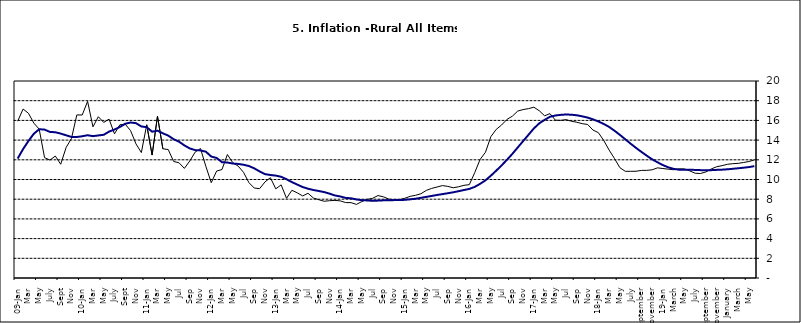
| Category | Series 0 | Series 1 |
|---|---|---|
| 09-Jan | 15.918 | 12.128 |
| Feb | 17.154 | 13.086 |
| Mar | 16.729 | 13.912 |
| Apr | 15.727 | 14.644 |
| May | 15.113 | 15.104 |
| June | 12.213 | 15.067 |
| July | 11.974 | 14.832 |
| Aug | 12.38 | 14.796 |
| Sept | 11.548 | 14.661 |
| Oct | 13.242 | 14.488 |
| Nov | 14.164 | 14.321 |
|  | 16.557 | 14.316 |
| 10-Jan | 16.548 | 14.39 |
| Feb | 17.934 | 14.494 |
| Mar | 15.346 | 14.401 |
| Apr | 16.373 | 14.473 |
| May | 15.794 | 14.54 |
| June | 16.126 | 14.862 |
| July | 14.634 | 15.072 |
| Aug | 15.556 | 15.33 |
| Sept | 15.616 | 15.658 |
| Oct | 14.955 | 15.786 |
| Nov | 13.616 | 15.719 |
| Dec | 12.735 | 15.385 |
| 11-Jan | 15.553 | 15.311 |
| Feb | 12.482 | 14.856 |
| Mar | 16.422 | 14.956 |
| Apr | 13.117 | 14.687 |
| May | 13.041 | 14.457 |
| Jun | 11.83 | 14.095 |
| Jul | 11.699 | 13.84 |
| Aug | 11.13 | 13.464 |
| Sep | 11.878 | 13.156 |
| Oct | 12.778 | 12.985 |
| Nov | 13.147 | 12.95 |
| Dec | 11.326 | 12.824 |
| 12-Jan | 9.678 | 12.33 |
| Feb | 10.856 | 12.188 |
| Mar | 11.014 | 11.76 |
| Apr | 12.536 | 11.724 |
| May | 11.712 | 11.621 |
| Jun | 11.36 | 11.582 |
| Jul | 10.733 | 11.499 |
| Aug | 9.683 | 11.368 |
| Sep | 9.132 | 11.131 |
| Oct | 9.071 | 10.82 |
| Nov | 9.758 | 10.548 |
| Dec | 10.183 | 10.455 |
| 13-Jan | 9.052 | 10.394 |
| Feb | 9.457 | 10.276 |
| Mar | 8.091 | 10.025 |
| Apr | 8.907 | 9.732 |
| May | 8.647 | 9.483 |
| Jun | 8.333 | 9.236 |
| Jul | 8.6 | 9.063 |
| Aug | 8.12 | 8.933 |
| Sep | 7.95 | 8.832 |
| Oct | 7.791 | 8.722 |
| Nov | 7.849 | 8.565 |
| Dec | 7.879 | 8.378 |
| 14-Jan | 7.832 | 8.277 |
| Feb | 7.657 | 8.13 |
| Mar | 7.65 | 8.092 |
| Apr | 7.473 | 7.973 |
| May | 7.761 | 7.901 |
| Jun | 7.98 | 7.874 |
| Jul | 8.086 | 7.834 |
| Aug | 8.368 | 7.858 |
| Sep | 8.244 | 7.883 |
| Oct | 8.019 | 7.903 |
| Nov | 7.898 | 7.906 |
| Dec | 7.955 | 7.913 |
| 15-Jan | 8.094 | 7.935 |
| Feb | 8.291 | 7.988 |
| Mar | 8.396 | 8.05 |
| Apr | 8.556 | 8.14 |
| May | 8.896 | 8.236 |
| Jun | 9.098 | 8.331 |
| Jul | 9.238 | 8.429 |
| Aug | 9.382 | 8.516 |
| Sep | 9.3 | 8.606 |
| Oct | 9.162 | 8.7 |
| Nov | 9.261 | 8.813 |
| Dec | 9.41 | 8.933 |
| 16-Jan | 9.48 | 9.047 |
| Feb | 10.692 | 9.249 |
| Mar | 12.038 | 9.559 |
| Apr | 12.767 | 9.917 |
| May | 14.349 | 10.384 |
| Jun | 15.088 | 10.897 |
| Jul | 15.533 | 11.433 |
| Aug | 16.103 | 12.002 |
| Sep | 16.428 | 12.601 |
| Oct | 16.947 | 13.25 |
| Nov | 17.099 | 13.898 |
| Dec | 17.195 | 14.54 |
| 17-Jan | 17.341 | 15.183 |
| Feb | 16.982 | 15.696 |
| Mar | 16.466 | 16.054 |
| Apr | 16.687 | 16.369 |
| May | 16.023 | 16.497 |
| Jun | 16.007 | 16.563 |
| Jul | 16.078 | 16.6 |
| Aug | 15.914 | 16.577 |
| Sep | 15.812 | 16.52 |
| Oct | 15.666 | 16.411 |
| Nov | 15.587 | 16.285 |
| Dec | 15.018 | 16.104 |
| 18-Jan | 14.756 | 15.892 |
| Feb | 13.957 | 15.638 |
| Mar | 12.987 | 15.339 |
| Apr | 12.126 | 14.95 |
| May | 11.199 | 14.53 |
| June | 10.832 | 14.083 |
| July | 10.831 | 13.636 |
| August | 10.838 | 13.209 |
| September | 10.924 | 12.804 |
| October | 10.927 | 12.418 |
| November | 10.986 | 12.049 |
| December | 11.183 | 11.746 |
| 19-Jan | 11.115 | 11.462 |
| February | 11.048 | 11.234 |
| March | 10.99 | 11.078 |
| April | 11.08 | 10.997 |
| May | 11.075 | 10.988 |
| June | 10.874 | 10.99 |
| July | 10.636 | 10.972 |
| August | 10.609 | 10.951 |
| September | 10.771 | 10.937 |
| October | 11.074 | 10.95 |
| November | 11.296 | 10.977 |
| December | 11.406 | 10.998 |
| January | 11.543 | 11.037 |
| February | 11.606 | 11.086 |
| March | 11.639 | 11.141 |
| April | 11.728 | 11.197 |
| May | 11.826 | 11.261 |
| June | 11.988 | 11.355 |